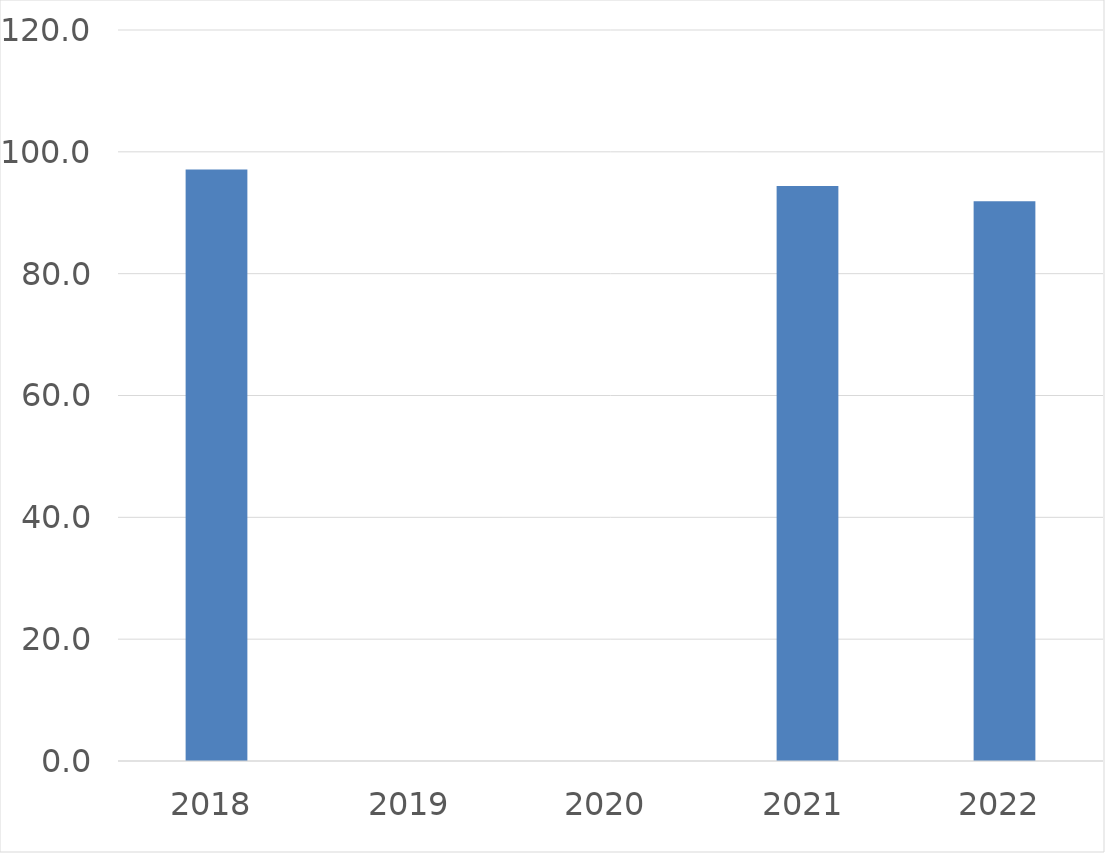
| Category | Series 0 |
|---|---|
| 2018 | 97.1 |
| 2019 | 0 |
| 2020 | 0 |
| 2021 | 94.4 |
| 2022 | 91.9 |